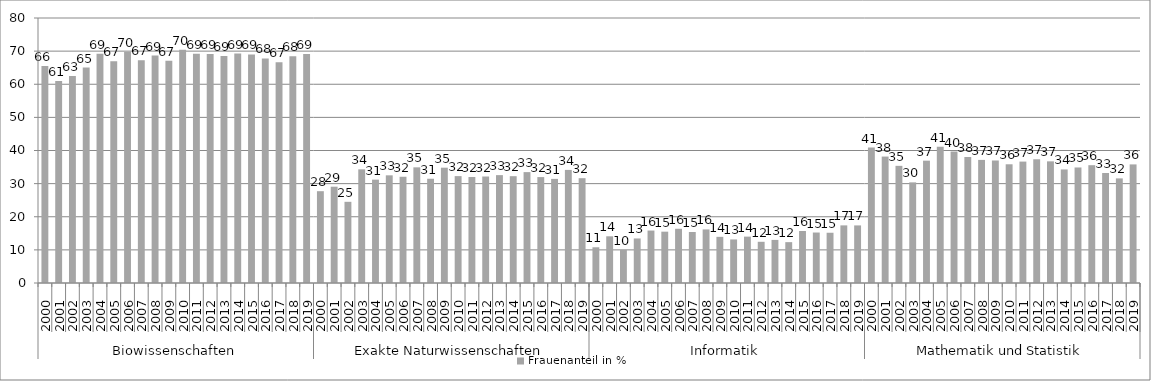
| Category | Frauenanteil in % |
|---|---|
| 0 | 65.544 |
| 1 | 60.947 |
| 2 | 62.517 |
| 3 | 65.026 |
| 4 | 69.206 |
| 5 | 66.933 |
| 6 | 69.813 |
| 7 | 67.259 |
| 8 | 68.65 |
| 9 | 67.077 |
| 10 | 70.419 |
| 11 | 69.171 |
| 12 | 69.116 |
| 13 | 68.521 |
| 14 | 69.246 |
| 15 | 68.986 |
| 16 | 67.81 |
| 17 | 66.623 |
| 18 | 68.48 |
| 19 | 69.147 |
| 20 | 27.717 |
| 21 | 29.072 |
| 22 | 24.51 |
| 23 | 34.312 |
| 24 | 31.201 |
| 25 | 32.507 |
| 26 | 32.073 |
| 27 | 34.917 |
| 28 | 31.472 |
| 29 | 34.81 |
| 30 | 32.268 |
| 31 | 31.994 |
| 32 | 32.147 |
| 33 | 32.566 |
| 34 | 32.248 |
| 35 | 33.475 |
| 36 | 31.977 |
| 37 | 31.43 |
| 38 | 34.142 |
| 39 | 31.641 |
| 40 | 10.787 |
| 41 | 14.103 |
| 42 | 10 |
| 43 | 13.446 |
| 44 | 15.834 |
| 45 | 15.498 |
| 46 | 16.37 |
| 47 | 15.395 |
| 48 | 16.175 |
| 49 | 13.932 |
| 50 | 13.148 |
| 51 | 13.998 |
| 52 | 12.441 |
| 53 | 13.011 |
| 54 | 12.334 |
| 55 | 15.693 |
| 56 | 15.237 |
| 57 | 15.17 |
| 58 | 17.394 |
| 59 | 17.385 |
| 60 | 40.876 |
| 61 | 38.168 |
| 62 | 35.366 |
| 63 | 30.38 |
| 64 | 36.932 |
| 65 | 41.096 |
| 66 | 39.683 |
| 67 | 38.043 |
| 68 | 37.16 |
| 69 | 36.983 |
| 70 | 35.841 |
| 71 | 36.652 |
| 72 | 37.352 |
| 73 | 36.726 |
| 74 | 34.28 |
| 75 | 34.874 |
| 76 | 35.565 |
| 77 | 33.201 |
| 78 | 31.579 |
| 79 | 35.802 |